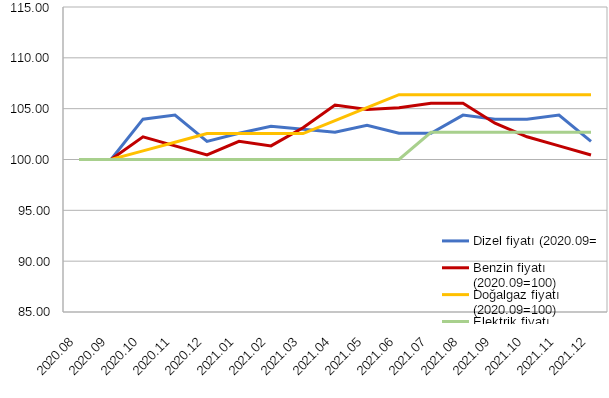
| Category | Dizel fiyatı | Benzin fiyatı | Doğalgaz fiyatı | Elektrik fiyatı |
|---|---|---|---|---|
| 2020-08-05 | 100 | 100 | 100 | 100 |
| 2020-09-05 | 100 | 100 | 100 | 100 |
| 2020-10-06 | 103.969 | 102.234 | 100.85 | 100 |
| 2020-11-06 | 104.365 | 101.34 | 101.701 | 100 |
| 2020-12-07 | 101.786 | 100.447 | 102.551 | 100 |
| 2021-01-07 | 102.58 | 101.787 | 102.551 | 100 |
| 2021-02-07 | 103.274 | 101.34 | 102.551 | 100 |
| 2021-03-10 | 102.976 | 103.128 | 102.551 | 100 |
| 2021-04-10 | 102.679 | 105.362 | 103.827 | 100 |
| 2021-05-11 | 103.373 | 104.915 | 105.103 | 100 |
| 2021-06-11 | 102.58 | 105.094 | 106.378 | 100 |
| 2021-07-12 | 102.58 | 105.541 | 106.378 | 102.673 |
| 2021-08-12 | 104.365 | 105.541 | 106.378 | 102.673 |
| 2021-09-12 | 103.969 | 103.575 | 106.378 | 102.673 |
| 2021-10-13 | 103.969 | 102.234 | 106.378 | 102.673 |
| 2021-11-13 | 104.365 | 101.34 | 106.378 | 102.673 |
| 2021-12-14 | 101.786 | 100.447 | 106.378 | 102.673 |